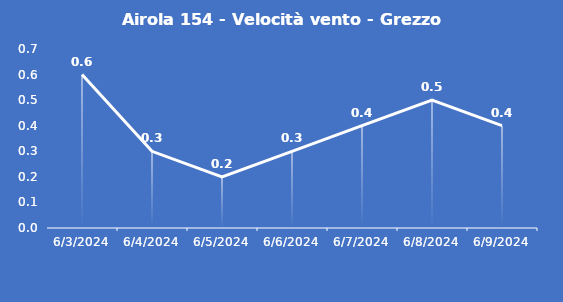
| Category | Airola 154 - Velocità vento - Grezzo (m/s) |
|---|---|
| 6/3/24 | 0.6 |
| 6/4/24 | 0.3 |
| 6/5/24 | 0.2 |
| 6/6/24 | 0.3 |
| 6/7/24 | 0.4 |
| 6/8/24 | 0.5 |
| 6/9/24 | 0.4 |